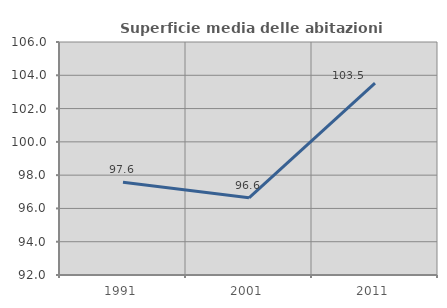
| Category | Superficie media delle abitazioni occupate |
|---|---|
| 1991.0 | 97.571 |
| 2001.0 | 96.635 |
| 2011.0 | 103.535 |